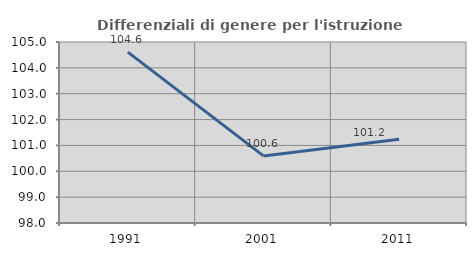
| Category | Differenziali di genere per l'istruzione superiore |
|---|---|
| 1991.0 | 104.609 |
| 2001.0 | 100.595 |
| 2011.0 | 101.242 |